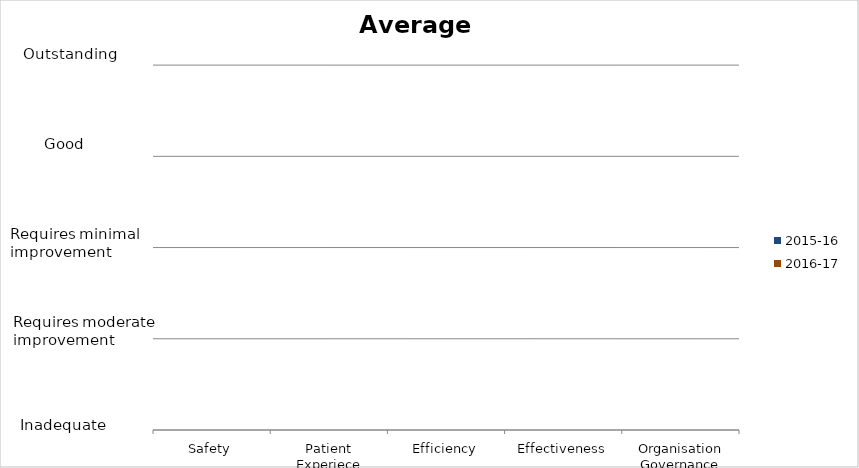
| Category | 2015-16 | 2016-17 |
|---|---|---|
| Safety | 0 | 0 |
| Patient Experiece | 0 | 0 |
| Efficiency | 0 | 0 |
| Effectiveness | 0 | 0 |
| Organisation Governance | 0 | 0 |